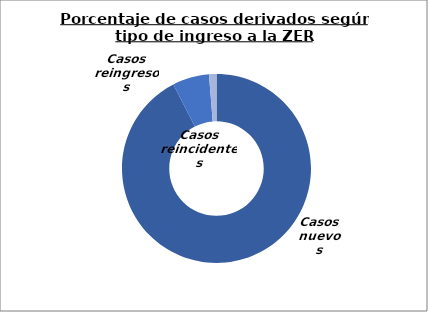
| Category | Series 0 |
|---|---|
| Casos nuevos | 870 |
| Casos reincidentes | 59 |
| Casos reingresos | 12 |